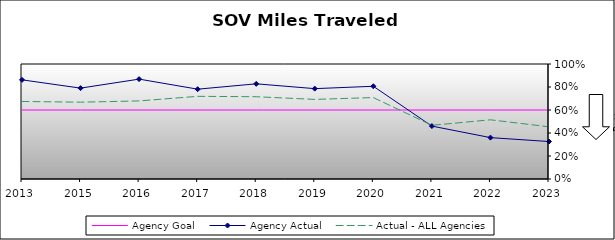
| Category | Agency Goal | Agency Actual | Actual - ALL Agencies |
|---|---|---|---|
| 2013.0 | 0.6 | 0.862 | 0.674 |
| 2015.0 | 0.6 | 0.79 | 0.668 |
| 2016.0 | 0.6 | 0.868 | 0.679 |
| 2017.0 | 0.6 | 0.781 | 0.719 |
| 2018.0 | 0.6 | 0.828 | 0.715 |
| 2019.0 | 0.6 | 0.786 | 0.692 |
| 2020.0 | 0.6 | 0.806 | 0.708 |
| 2021.0 | 0.6 | 0.46 | 0.467 |
| 2022.0 | 0.6 | 0.36 | 0.515 |
| 2023.0 | 0.6 | 0.326 | 0.454 |